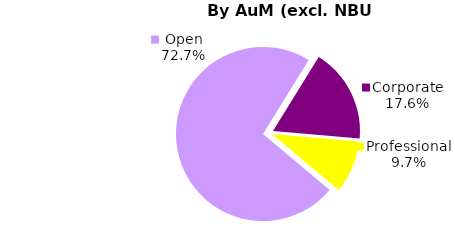
| Category | Series 0 |
|---|---|
| Open | 991.538 |
| Corporate | 239.869 |
| Professional | 132.731 |